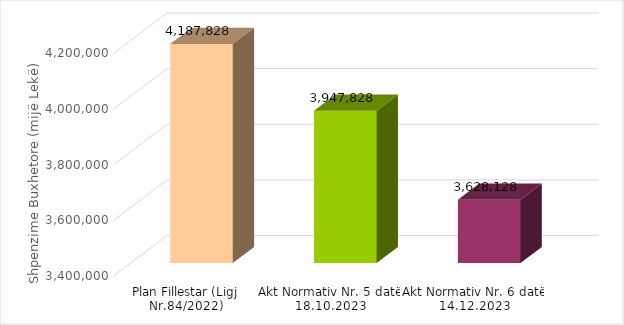
| Category | Shërbimet e Shëndetit Publik |
|---|---|
| Plan Fillestar (Ligj Nr.84/2022) | 4187828 |
| Akt Normativ Nr. 5 datë 18.10.2023 | 3947828 |
| Akt Normativ Nr. 6 datë 14.12.2023 | 3628128 |